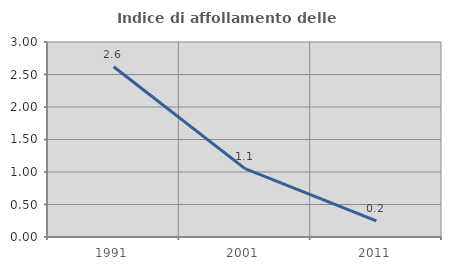
| Category | Indice di affollamento delle abitazioni  |
|---|---|
| 1991.0 | 2.618 |
| 2001.0 | 1.051 |
| 2011.0 | 0.249 |